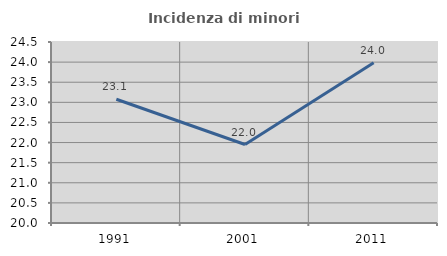
| Category | Incidenza di minori stranieri |
|---|---|
| 1991.0 | 23.077 |
| 2001.0 | 21.951 |
| 2011.0 | 23.984 |